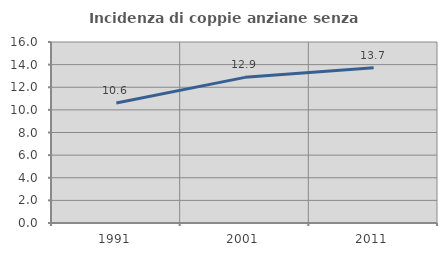
| Category | Incidenza di coppie anziane senza figli  |
|---|---|
| 1991.0 | 10.615 |
| 2001.0 | 12.875 |
| 2011.0 | 13.713 |